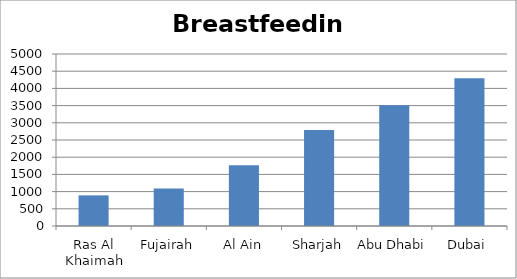
| Category | Total |
|---|---|
| Ras Al Khaimah | 890 |
| Fujairah | 1087 |
| Al Ain | 1765 |
| Sharjah | 2789 |
| Abu Dhabi | 3509 |
| Dubai | 4298 |